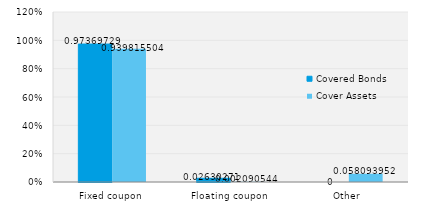
| Category | Covered Bonds | Cover Assets |
|---|---|---|
| Fixed coupon | 0.974 | 0.94 |
| Floating coupon | 0.026 | 0.002 |
| Other | 0 | 0.058 |